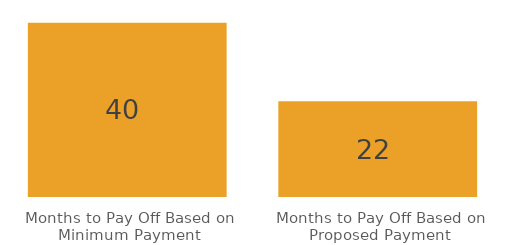
| Category | Series 0 |
|---|---|
| Months to Pay Off Based on Minimum Payment | 40 |
| Months to Pay Off Based on Proposed Payment | 22 |